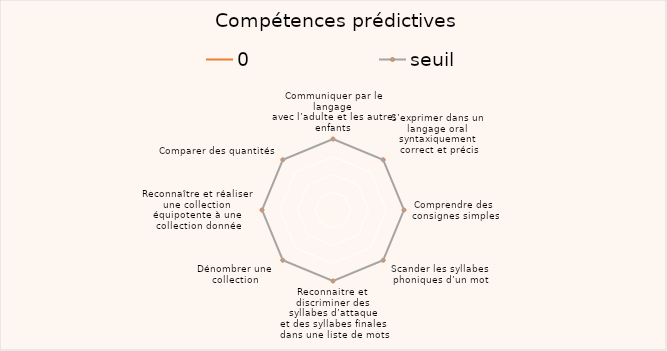
| Category | 0 | seuil |
|---|---|---|
| Communiquer par le langage 
avec l’adulte et les autres enfants |  | 2 |
| S’exprimer dans un 
langage oral 
syntaxiquement 
correct et précis |  | 2 |
| Comprendre des 
consignes simples |  | 2 |
| Scander les syllabes 
phoniques d’un mot |  | 2 |
| Reconnaitre et 
discriminer des 
syllabes d’attaque 
et des syllabes finales 
dans une liste de mots |  | 2 |
| Dénombrer une 
collection  |  | 2 |
| Reconnaître et réaliser 
une collection 
équipotente à une 
collection donnée |  | 2 |
| Comparer des quantités  |  | 2 |